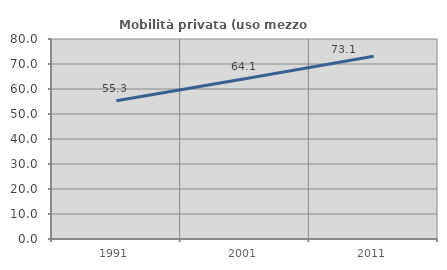
| Category | Mobilità privata (uso mezzo privato) |
|---|---|
| 1991.0 | 55.327 |
| 2001.0 | 64.076 |
| 2011.0 | 73.126 |